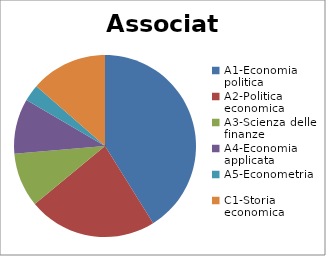
| Category | Associati | Series 1 |
|---|---|---|
| A1-Economia politica | 248 |  |
| A2-Politica economica | 138 |  |
| A3-Scienza delle finanze | 58 |  |
| A4-Economia applicata | 59 |  |
| A5-Econometria | 18 |  |
| C1-Storia economica | 82 |  |